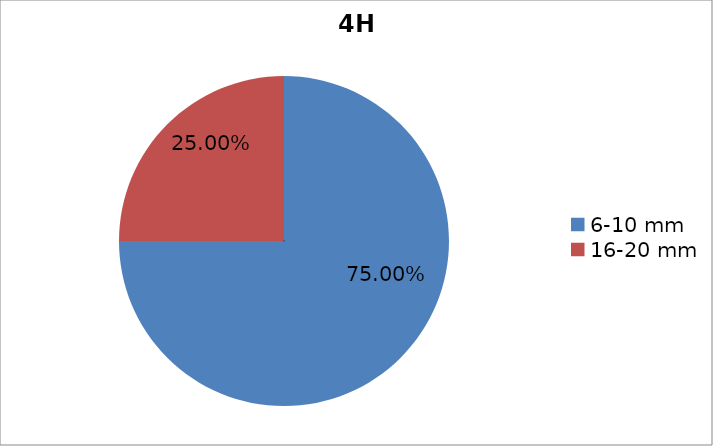
| Category | Series 0 |
|---|---|
| 6-10 mm  | 0.75 |
| 16-20 mm | 0.25 |